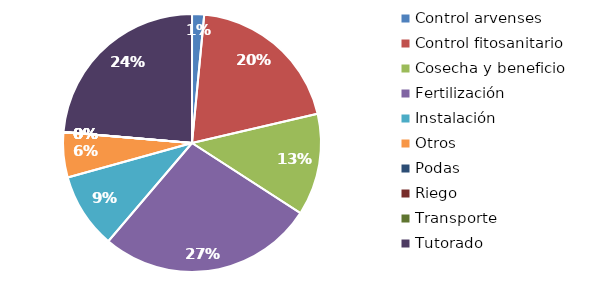
| Category | Valor |
|---|---|
| Control arvenses | 128000 |
| Control fitosanitario | 1679000 |
| Cosecha y beneficio | 1080000 |
| Fertilización | 2292000 |
| Instalación | 800000 |
| Otros | 480000 |
| Podas | 0 |
| Riego | 0 |
| Transporte | 0 |
| Tutorado | 2000000 |